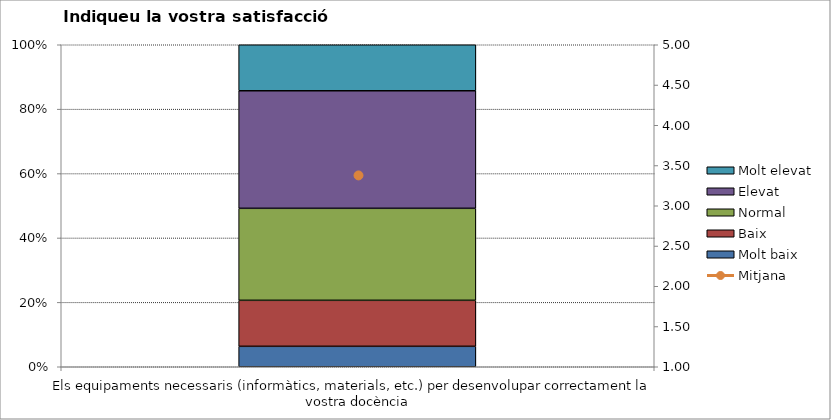
| Category | Molt baix | Baix | Normal  | Elevat | Molt elevat |
|---|---|---|---|---|---|
| Els equipaments necessaris (informàtics, materials, etc.) per desenvolupar correctament la vostra docència | 4 | 9 | 18 | 23 | 9 |